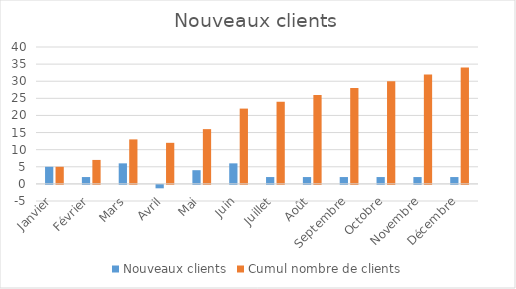
| Category | Nouveaux clients | Cumul nombre de clients |
|---|---|---|
| Janvier | 5 | 5 |
| Février | 2 | 7 |
| Mars | 6 | 13 |
| Avril | -1 | 12 |
| Mai | 4 | 16 |
| Juin | 6 | 22 |
| Juillet | 2 | 24 |
| Août | 2 | 26 |
| Septembre | 2 | 28 |
| Octobre | 2 | 30 |
| Novembre | 2 | 32 |
| Décembre | 2 | 34 |